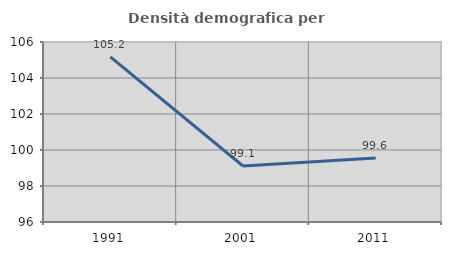
| Category | Densità demografica |
|---|---|
| 1991.0 | 105.175 |
| 2001.0 | 99.112 |
| 2011.0 | 99.553 |